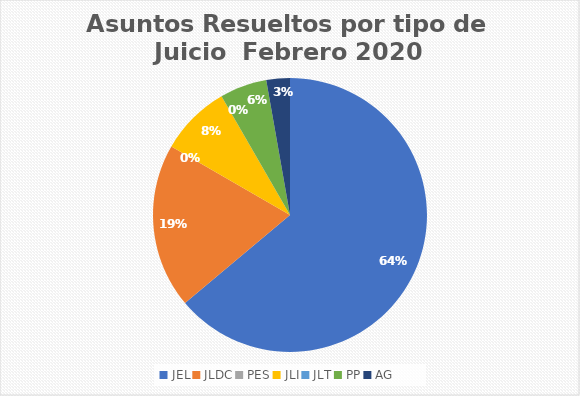
| Category | Asuntos Resueltos por tipo de Juicio  Febrero |
|---|---|
| JEL | 23 |
| JLDC | 7 |
| PES | 0 |
| JLI | 3 |
| JLT | 0 |
| PP | 2 |
| AG | 1 |